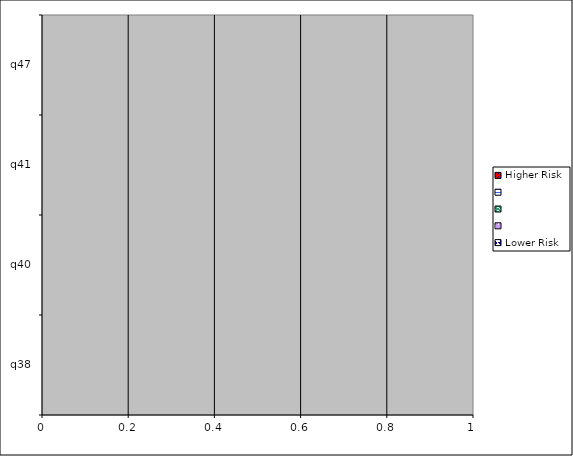
| Category | Higher Risk |   | Lower Risk |
|---|---|---|---|
| q38 | 0 | 0 | 0 |
| q40 | 0 | 0 | 0 |
| q41 | 0 | 0 | 0 |
| q47 | 0 | 0 | 0 |